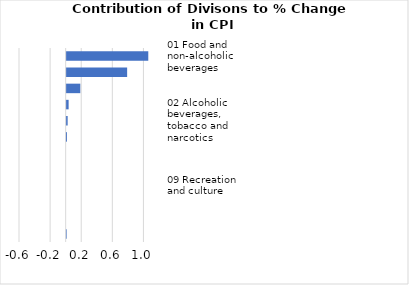
| Category |     Contributions |
|---|---|
| 01 Food and non-alcoholic beverages | 1.049 |
| 07 Transport | 0.778 |
| 04 Housing, water, electricity, gas and other fuels | 0.175 |
| 05 Furnishings, household equipment and maintenance | 0.025 |
| 02 Alcoholic beverages, tobacco and narcotics | 0.013 |
| 12 Miscellaneous goods and services | 0.005 |
| 11 Restaurants and hotels | 0 |
| 08 Communication | 0 |
| 09 Recreation and culture | 0 |
| 06 Health | 0 |
| 10 Education | 0 |
| 03 Clothing and footwear | -0.001 |